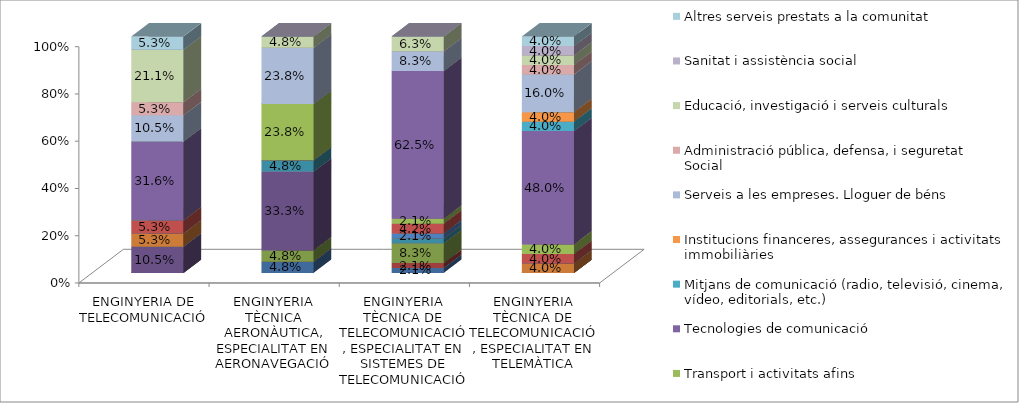
| Category | Electricitat, gas i aigua. Fabricació de generadors de vapor, captació, depuració i distribució d'aigua | Indústries farmacèutiques i cosmètiques | Metal·lúrgia, material elèctric i de precisió | Materials de transport. Fabricació vehicles motor, bicicletes, construcció naval, material ferroviari, etc. | Productes alimentaris, begudes i tabac | Indústries tèxtils, del cuir i de confeccions | Indústries de la fusta, suro i mobles de fusta | Comerç i reparacions | Transport i activitats afins | Tecnologies de comunicació | Mitjans de comunicació (radio, televisió, cinema, vídeo, editorials, etc.) | Institucions financeres, assegurances i activitats immobiliàries | Serveis a les empreses. Lloguer de béns | Administració pública, defensa, i seguretat Social | Educació, investigació i serveis culturals | Sanitat i assistència social | Altres serveis prestats a la comunitat |
|---|---|---|---|---|---|---|---|---|---|---|---|---|---|---|---|---|---|
| ENGINYERIA DE TELECOMUNICACIÓ | 0 | 0 | 0 | 0.105 | 0 | 0.053 | 0 | 0.053 | 0 | 0.316 | 0 | 0 | 0.105 | 0.053 | 0.211 | 0 | 0.053 |
| ENGINYERIA TÈCNICA AERONÀUTICA, ESPECIALITAT EN AERONAVEGACIÓ | 0.048 | 0 | 0.048 | 0.333 | 0.048 | 0 | 0 | 0 | 0.238 | 0 | 0 | 0 | 0.238 | 0 | 0.048 | 0 | 0 |
| ENGINYERIA TÈCNICA DE TELECOMUNICACIÓ, ESPECIALITAT EN SISTEMES DE TELECOMUNICACIÓ | 0.021 | 0.021 | 0.083 | 0 | 0.021 | 0 | 0.021 | 0.042 | 0.021 | 0.625 | 0 | 0 | 0.083 | 0 | 0.062 | 0 | 0 |
| ENGINYERIA TÈCNICA DE TELECOMUNICACIÓ, ESPECIALITAT EN TELEMÀTICA | 0 | 0 | 0 | 0 | 0 | 0.04 | 0 | 0.04 | 0.04 | 0.48 | 0.04 | 0.04 | 0.16 | 0.04 | 0.04 | 0.04 | 0.04 |